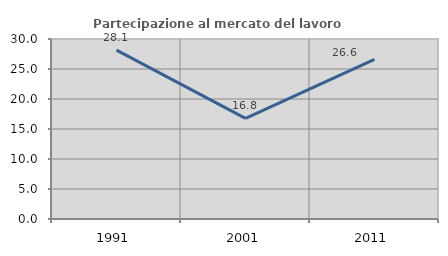
| Category | Partecipazione al mercato del lavoro  femminile |
|---|---|
| 1991.0 | 28.144 |
| 2001.0 | 16.783 |
| 2011.0 | 26.613 |